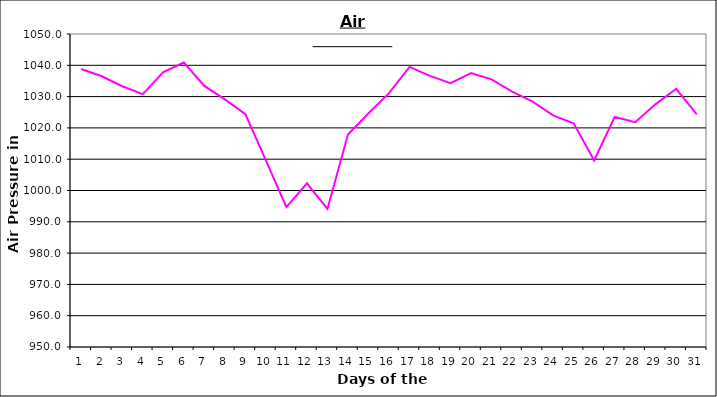
| Category | Series 0 |
|---|---|
| 0 | 1038.8 |
| 1 | 1036.5 |
| 2 | 1033.3 |
| 3 | 1030.8 |
| 4 | 1037.8 |
| 5 | 1040.9 |
| 6 | 1033.4 |
| 7 | 1029.1 |
| 8 | 1024.4 |
| 9 | 1009.6 |
| 10 | 994.7 |
| 11 | 1002.3 |
| 12 | 994.1 |
| 13 | 1017.9 |
| 14 | 1024.7 |
| 15 | 1031.1 |
| 16 | 1039.5 |
| 17 | 1036.6 |
| 18 | 1034.3 |
| 19 | 1037.5 |
| 20 | 1035.5 |
| 21 | 1031.6 |
| 22 | 1028.4 |
| 23 | 1024 |
| 24 | 1021.5 |
| 25 | 1009.6 |
| 26 | 1023.5 |
| 27 | 1021.8 |
| 28 | 1027.6 |
| 29 | 1032.5 |
| 30 | 1024.3 |